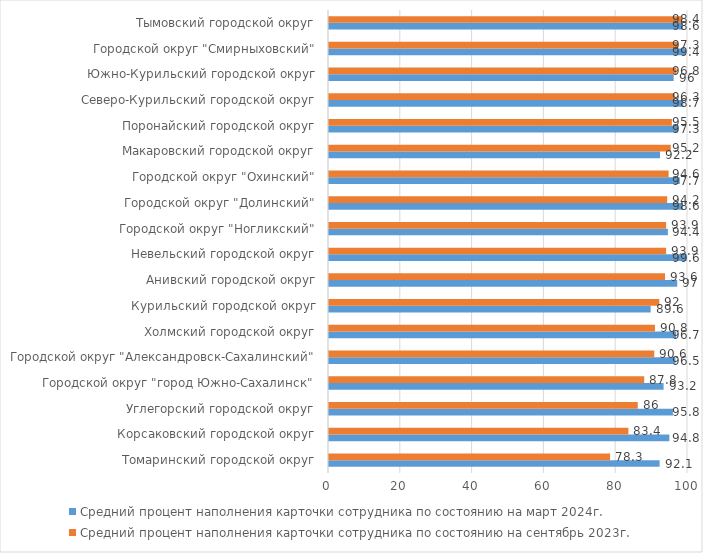
| Category | Средний процент наполнения карточки сотрудника по состоянию на март 2024г. | Средний процент наполнения карточки сотрудника по состоянию на сентябрь 2023г. |
|---|---|---|
| Томаринский городской округ | 92.1 | 78.3 |
| Корсаковский городской округ | 94.8 | 83.4 |
| Углегорский городской округ | 95.8 | 86 |
| Городской округ "город Южно-Сахалинск" | 93.2 | 87.8 |
| Городской округ "Александровск-Сахалинский" | 96.5 | 90.6 |
| Холмский городской округ | 96.7 | 90.8 |
| Курильский городской округ | 89.6 | 92 |
| Анивский городской округ | 97 | 93.6 |
| Невельский городской округ | 99.6 | 93.9 |
| Городской округ "Ногликский" | 94.4 | 93.9 |
| Городской округ "Долинский" | 98.6 | 94.2 |
| Городской округ "Охинский" | 97.7 | 94.6 |
| Макаровский городской округ | 92.2 | 95.2 |
| Поронайский городской округ | 97.3 | 95.5 |
| Северо-Курильский городской округ | 98.7 | 96.3 |
| Южно-Курильский городской округ | 96 | 96.8 |
| Городской округ "Смирныховский" | 99.4 | 97.3 |
| Тымовский городской округ | 98.6 | 98.4 |